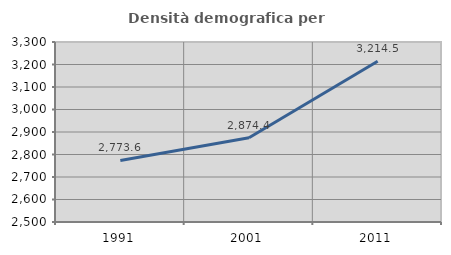
| Category | Densità demografica |
|---|---|
| 1991.0 | 2773.614 |
| 2001.0 | 2874.365 |
| 2011.0 | 3214.487 |